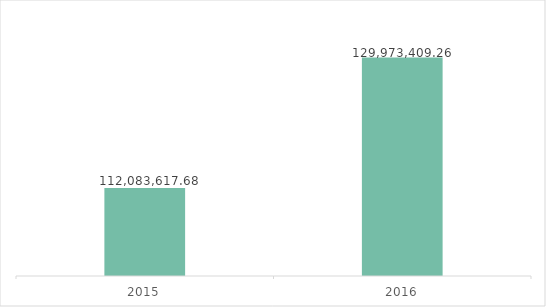
| Category | Renda |
|---|---|
| 2015.0 | 112083617.68 |
| 2016.0 | 129973409.26 |